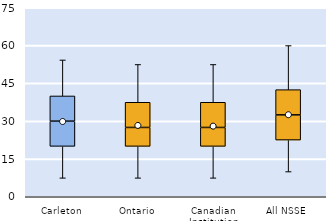
| Category | 25th | 50th | 75th |
|---|---|---|---|
| Carleton | 20 | 10 | 10 |
| Ontario | 20 | 7.5 | 10 |
| Canadian Institution | 20 | 7.5 | 10 |
| All NSSE | 22.5 | 10 | 10 |